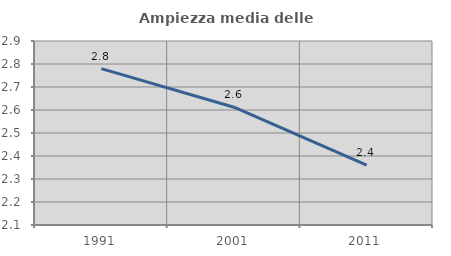
| Category | Ampiezza media delle famiglie |
|---|---|
| 1991.0 | 2.78 |
| 2001.0 | 2.612 |
| 2011.0 | 2.36 |